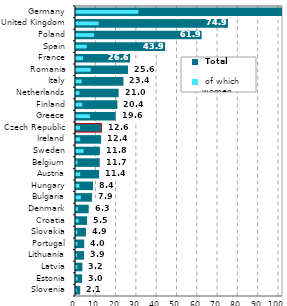
| Category |  Total |
|---|---|
| Slovenia | 2.073 |
| Estonia | 3.025 |
| Latvia | 3.164 |
| Lithuania | 3.938 |
| Portugal | 4.042 |
| Slovakia | 4.902 |
| Croatia | 5.451 |
| Denmark | 6.255 |
| Bulgaria | 7.903 |
| Hungary | 8.418 |
| Austria | 11.393 |
| Belgium | 11.699 |
| Sweden | 11.758 |
| Ireland | 12.374 |
| Czech Republic | 12.577 |
| Greece | 19.554 |
| Finland | 20.391 |
| Netherlands | 21.015 |
| Italy | 23.379 |
| Romania | 25.631 |
| France | 26.638 |
| Spain | 43.909 |
| Poland | 61.873 |
| United Kingdom | 74.892 |
| Germany | 149.745 |